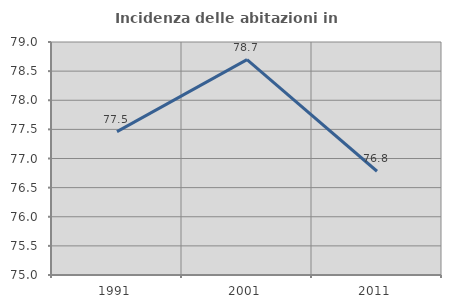
| Category | Incidenza delle abitazioni in proprietà  |
|---|---|
| 1991.0 | 77.461 |
| 2001.0 | 78.697 |
| 2011.0 | 76.781 |